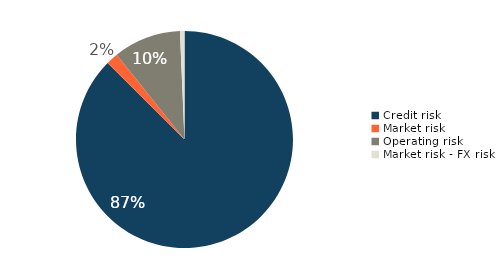
| Category | Series 0 |
|---|---|
| Credit risk | 0.874 |
| Market risk | 0.018 |
| Operating risk | 0.101 |
| Market risk - FX risk | 0.007 |